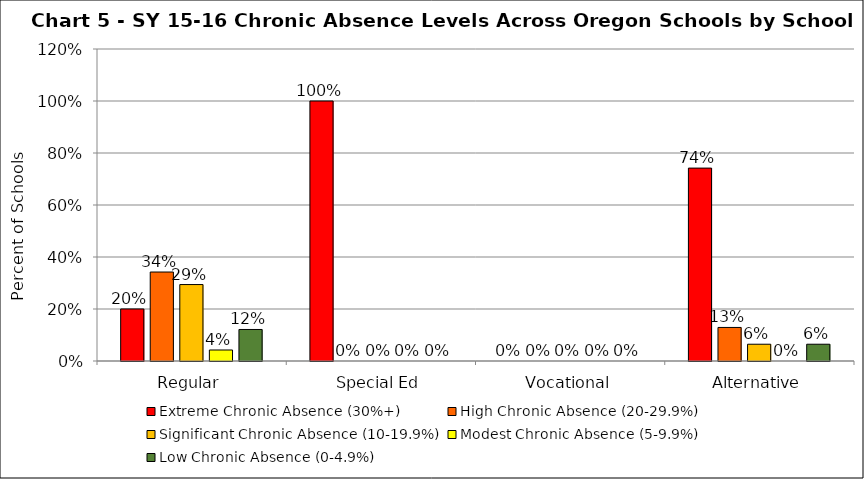
| Category | Extreme Chronic Absence (30%+) | High Chronic Absence (20-29.9%) | Significant Chronic Absence (10-19.9%) | Modest Chronic Absence (5-9.9%) | Low Chronic Absence (0-4.9%) |
|---|---|---|---|---|---|
| 0 | 0.2 | 0.342 | 0.294 | 0.042 | 0.121 |
| 1 | 1 | 0 | 0 | 0 | 0 |
| 2 | 0 | 0 | 0 | 0 | 0 |
| 3 | 0.742 | 0.129 | 0.065 | 0 | 0.065 |